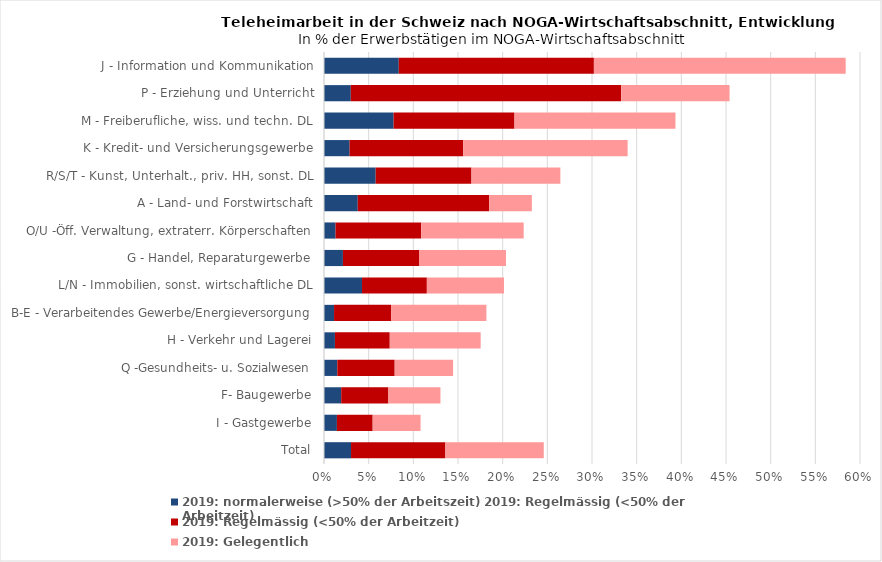
| Category | 2019: normalerweise (>50% der Arbeitszeit) 2019: Regelmässig (<50% der Arbeitzeit) | 2019: Regelmässig (<50% der Arbeitzeit) | 2019: Gelegentlich |
|---|---|---|---|
| Total | 0.03 | 0.106 | 0.11 |
| I - Gastgewerbe | 0.014 | 0.04 | 0.054 |
| F- Baugewerbe | 0.019 | 0.053 | 0.058 |
| Q -Gesundheits- u. Sozialwesen | 0.015 | 0.064 | 0.065 |
| H - Verkehr und Lagerei | 0.012 | 0.061 | 0.102 |
| B-E - Verarbeitendes Gewerbe/Energieversorgung | 0.011 | 0.064 | 0.107 |
| L/N - Immobilien, sonst. wirtschaftliche DL | 0.043 | 0.073 | 0.086 |
| G - Handel, Reparaturgewerbe | 0.021 | 0.085 | 0.097 |
| O/U -Öff. Verwaltung, extraterr. Körperschaften | 0.013 | 0.096 | 0.115 |
| A - Land- und Forstwirtschaft | 0.038 | 0.147 | 0.048 |
| R/S/T - Kunst, Unterhalt., priv. HH, sonst. DL | 0.058 | 0.107 | 0.1 |
| K - Kredit- und Versicherungsgewerbe | 0.029 | 0.127 | 0.184 |
| M - Freiberufliche, wiss. und techn. DL | 0.078 | 0.135 | 0.18 |
| P - Erziehung und Unterricht | 0.03 | 0.303 | 0.121 |
| J - Information und Kommunikation | 0.084 | 0.218 | 0.282 |